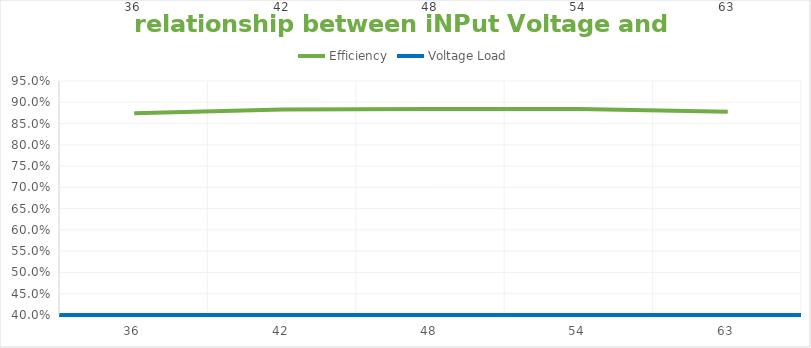
| Category | Efficiency | Voltage Load |
|---|---|---|
| 36.0 | 0.874 | 36 |
| 42.0 | 0.883 | 42 |
| 48.0 | 0.884 | 48 |
| 54.0 | 0.884 | 54 |
| 63.0 | 0.878 | 63 |